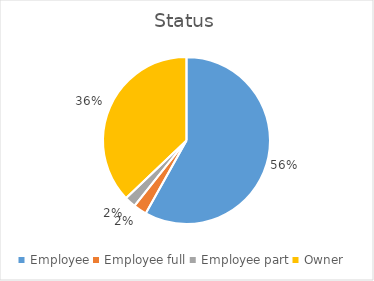
| Category | Status |
|---|---|
| Employee | 0.56 |
| Employee full | 0.025 |
| Employee part | 0.021 |
| Owner | 0.358 |